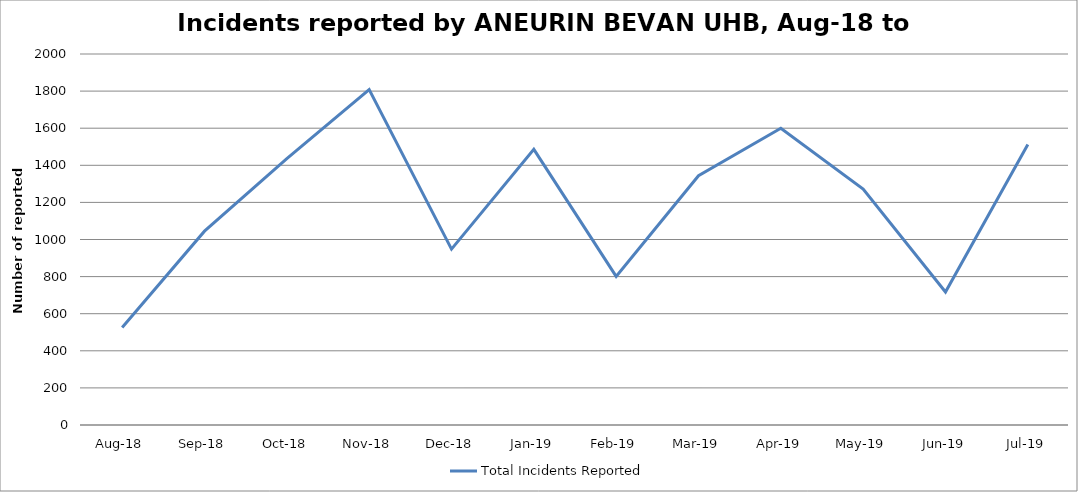
| Category | Total Incidents Reported |
|---|---|
| Aug-18 | 526 |
| Sep-18 | 1045 |
| Oct-18 | 1436 |
| Nov-18 | 1808 |
| Dec-18 | 948 |
| Jan-19 | 1486 |
| Feb-19 | 801 |
| Mar-19 | 1344 |
| Apr-19 | 1600 |
| May-19 | 1272 |
| Jun-19 | 717 |
| Jul-19 | 1512 |